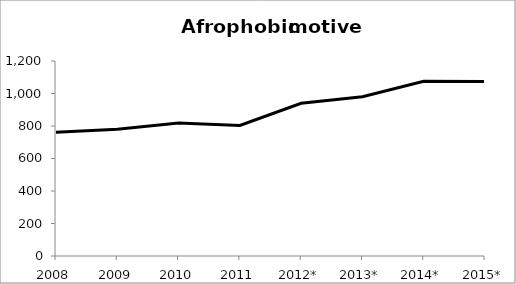
| Category | Series 0 |
|---|---|
| 2008 | 761 |
| 2009 | 780 |
| 2010 | 818 |
| 2011 | 803 |
| 2012* | 940 |
| 2013* | 980 |
| 2014* | 1075 |
| 2015* | 1074 |